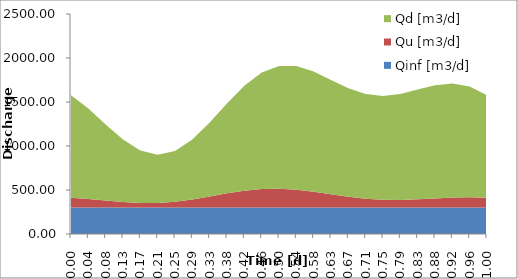
| Category | Qinf [m3/d] | Qu [m3/d] | Qd [m3/d] |
|---|---|---|---|
| 0.0 | 300 | 111.464 | 1165.992 |
| 0.0416666666666663 | 300 | 98.103 | 1027.59 |
| 0.08333333333333304 | 300 | 80.182 | 865.383 |
| 0.12499999999999978 | 300 | 63.005 | 710.569 |
| 0.16666666666666652 | 300 | 52.353 | 595.779 |
| 0.20833333333333326 | 300 | 52.855 | 546.94 |
| 0.25 | 300 | 66.625 | 576.653 |
| 0.29166666666666674 | 300 | 92.546 | 680.853 |
| 0.3333333333333335 | 300 | 126.391 | 839.631 |
| 0.3750000000000002 | 300 | 161.769 | 1022.022 |
| 0.41666666666666696 | 300 | 191.66 | 1193.517 |
| 0.4583333333333337 | 300 | 210.124 | 1324.323 |
| 0.5000000000000004 | 300 | 213.753 | 1396.255 |
| 0.5416666666666672 | 300 | 202.48 | 1406.45 |
| 0.5833333333333339 | 300 | 179.534 | 1367.021 |
| 0.6250000000000007 | 300 | 150.561 | 1300.799 |
| 0.6666666666666674 | 300 | 122.146 | 1234.378 |
| 0.7083333333333341 | 300 | 100.128 | 1190.388 |
| 0.7500000000000009 | 300 | 88.157 | 1181.101 |
| 0.7916666666666676 | 300 | 86.87 | 1205.108 |
| 0.8333333333333344 | 300 | 93.893 | 1247.966 |
| 0.8750000000000011 | 300 | 104.665 | 1286.61 |
| 0.9166666666666679 | 300 | 113.841 | 1296.326 |
| 0.9583333333333346 | 300 | 116.893 | 1258.349 |
| 1.0000000000000013 | 300 | 111.464 | 1165.992 |